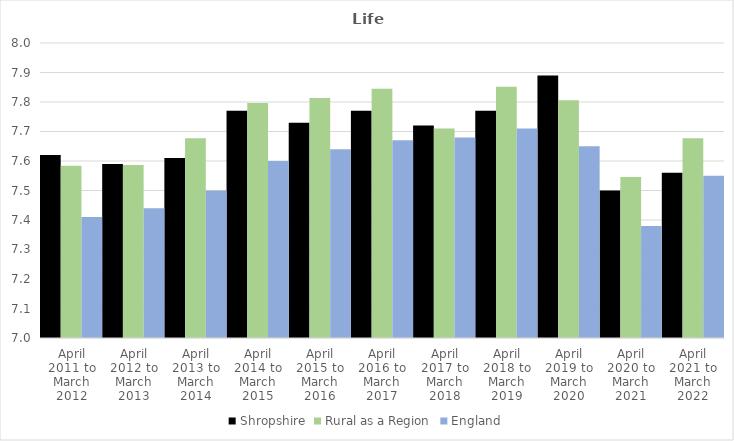
| Category | Shropshire | Rural as a Region | England |
|---|---|---|---|
| April 2011 to March 2012 | 7.62 | 7.584 | 7.41 |
| April 2012 to March 2013 | 7.59 | 7.586 | 7.44 |
| April 2013 to March 2014 | 7.61 | 7.677 | 7.5 |
| April 2014 to March 2015 | 7.77 | 7.797 | 7.6 |
| April 2015 to March 2016 | 7.73 | 7.813 | 7.64 |
| April 2016 to March 2017 | 7.77 | 7.845 | 7.67 |
| April 2017 to March 2018 | 7.72 | 7.71 | 7.68 |
| April 2018 to March 2019 | 7.77 | 7.852 | 7.71 |
| April 2019 to March 2020 | 7.89 | 7.806 | 7.65 |
| April 2020 to March 2021 | 7.5 | 7.546 | 7.38 |
| April 2021 to March 2022 | 7.56 | 7.677 | 7.55 |